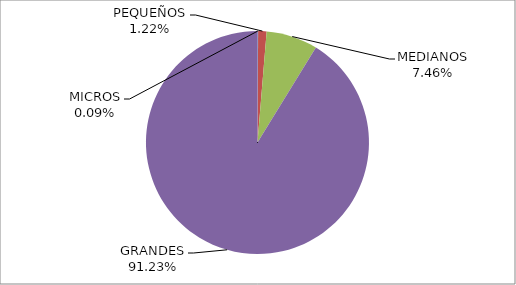
| Category | Series 0 |
|---|---|
| MICROS | 15168.95 |
| PEQUEÑOS | 204419.94 |
| MEDIANOS | 1249981.13 |
| GRANDES | 15279414.74 |